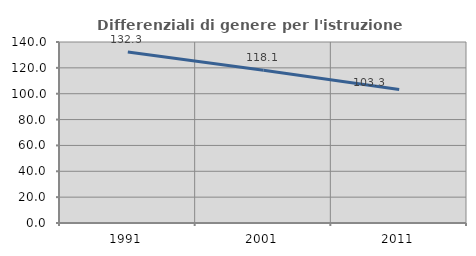
| Category | Differenziali di genere per l'istruzione superiore |
|---|---|
| 1991.0 | 132.302 |
| 2001.0 | 118.141 |
| 2011.0 | 103.31 |